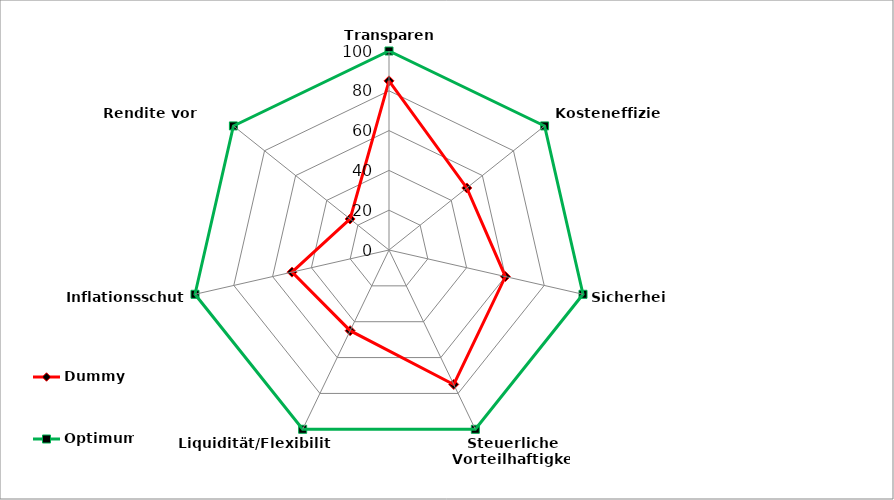
| Category | Dummy | Optimum |
|---|---|---|
| Transparenz | 85 | 100 |
| Kosteneffizienz | 50 | 100 |
| Sicherheit | 60 | 100 |
| Steuerliche Vorteilhaftigkeit | 75 | 100 |
| Liquidität/Flexibilität   | 45 | 100 |
| Inflationsschutz   | 50 | 100 |
| Rendite vor Steuern   | 25 | 100 |